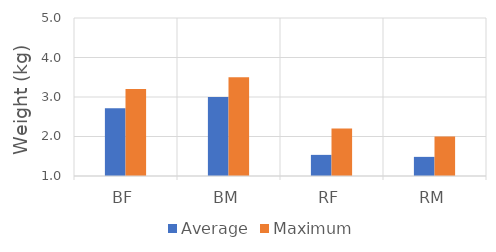
| Category | Average | Maximum |
|---|---|---|
| BF | 2.717 | 3.2 |
| BM | 3 | 3.5 |
| RF | 1.535 | 2.2 |
| RM | 1.484 | 2 |